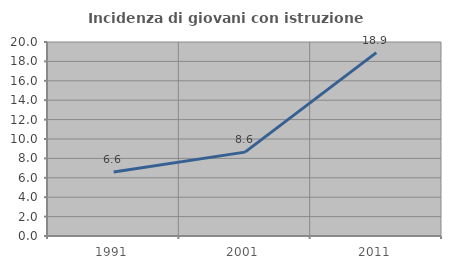
| Category | Incidenza di giovani con istruzione universitaria |
|---|---|
| 1991.0 | 6.6 |
| 2001.0 | 8.647 |
| 2011.0 | 18.901 |